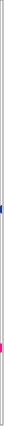
| Category | Nombre de demandes ayant au moins 1 jour sur le mois |
|---|---|
| 2020-03-01 | 1108000 |
| 2020-04-01 | 1239000 |
| 2020-05-01 | 1278000 |
| 2020-06-01 | 1142000 |